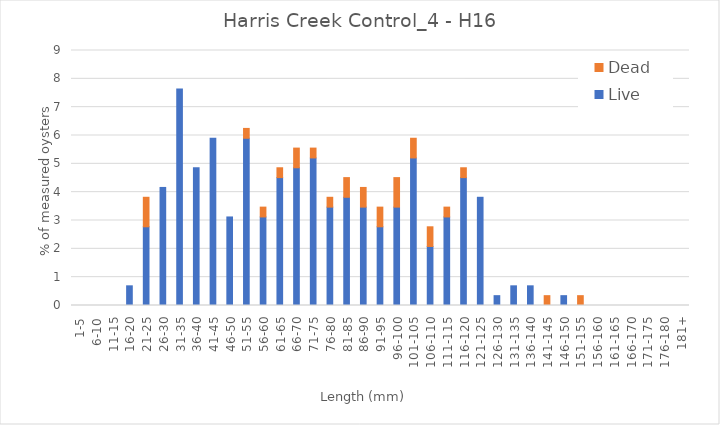
| Category | Live | Dead |
|---|---|---|
| 1-5 | 0 | 0 |
| 6-10 | 0 | 0 |
| 11-15 | 0 | 0 |
| 16-20 | 0.694 | 0 |
| 21-25 | 2.778 | 1.042 |
| 26-30 | 4.167 | 0 |
| 31-35 | 7.639 | 0 |
| 36-40 | 4.861 | 0 |
| 41-45 | 5.903 | 0 |
| 46-50 | 3.125 | 0 |
| 51-55 | 5.903 | 0.347 |
| 56-60 | 3.125 | 0.347 |
| 61-65 | 4.514 | 0.347 |
| 66-70 | 4.861 | 0.694 |
| 71-75 | 5.208 | 0.347 |
| 76-80 | 3.472 | 0.347 |
| 81-85 | 3.819 | 0.694 |
| 86-90 | 3.472 | 0.694 |
| 91-95 | 2.778 | 0.694 |
| 96-100 | 3.472 | 1.042 |
| 101-105 | 5.208 | 0.694 |
| 106-110 | 2.083 | 0.694 |
| 111-115 | 3.125 | 0.347 |
| 116-120 | 4.514 | 0.347 |
| 121-125 | 3.819 | 0 |
| 126-130 | 0.347 | 0 |
| 131-135 | 0.694 | 0 |
| 136-140 | 0.694 | 0 |
| 141-145 | 0 | 0.347 |
| 146-150 | 0.347 | 0 |
| 151-155 | 0 | 0.347 |
| 156-160 | 0 | 0 |
| 161-165 | 0 | 0 |
| 166-170 | 0 | 0 |
| 171-175 | 0 | 0 |
| 176-180 | 0 | 0 |
| 181+ | 0 | 0 |